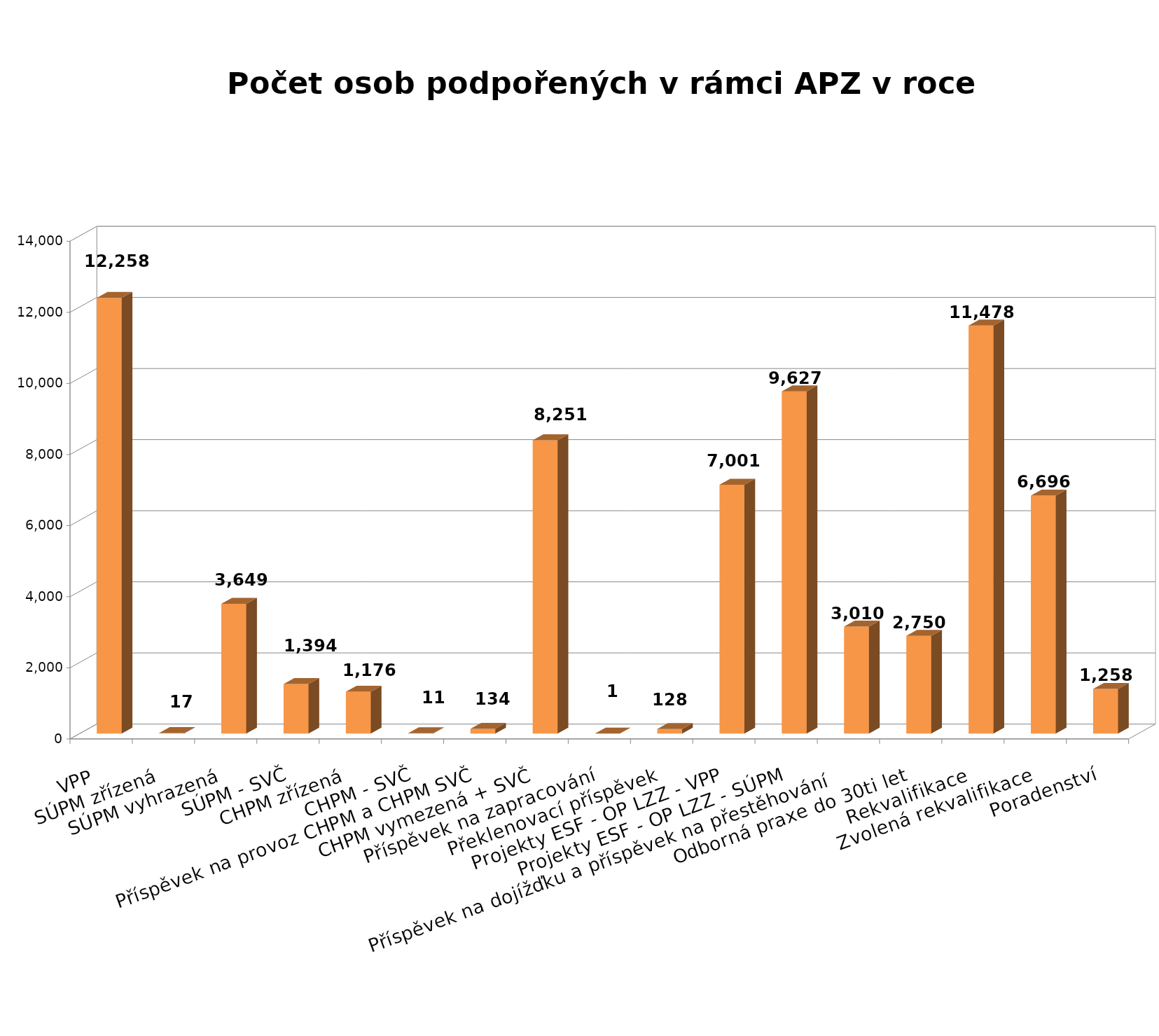
| Category | Series 0 |
|---|---|
| VPP | 12258 |
| SÚPM zřízená | 17 |
| SÚPM vyhrazená | 3649 |
| SÚPM - SVČ | 1394 |
| CHPM zřízená | 1176 |
| CHPM - SVČ | 11 |
| Příspěvek na provoz CHPM a CHPM SVČ | 134 |
| CHPM vymezená + SVČ | 8251 |
| Příspěvek na zapracování | 1 |
| Překlenovací příspěvek | 128 |
| Projekty ESF - OP LZZ - VPP | 7001 |
| Projekty ESF - OP LZZ - SÚPM | 9627 |
| Příspěvek na dojížďku a příspěvek na přestěhování      | 3010 |
| Odborná praxe do 30ti let | 2750 |
| Rekvalifikace | 11478 |
| Zvolená rekvalifikace | 6696 |
| Poradenství | 1258 |